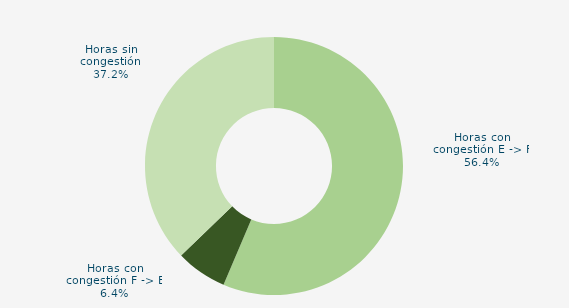
| Category | Horas con congestión E -> F |
|---|---|
| Horas con congestión E -> F | 56.399 |
| Horas con congestión F -> E | 6.399 |
| Horas sin congestión | 37.202 |